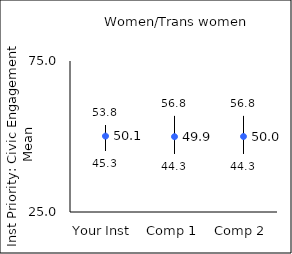
| Category | 25th percentile | 75th percentile | Mean |
|---|---|---|---|
| Your Inst | 45.3 | 53.8 | 50.13 |
| Comp 1 | 44.3 | 56.8 | 49.94 |
| Comp 2 | 44.3 | 56.8 | 50 |